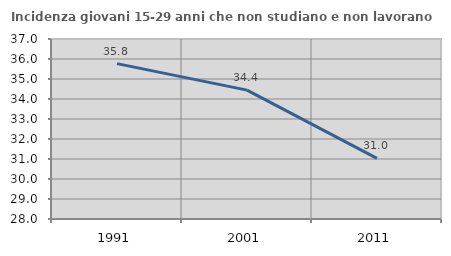
| Category | Incidenza giovani 15-29 anni che non studiano e non lavorano  |
|---|---|
| 1991.0 | 35.768 |
| 2001.0 | 34.444 |
| 2011.0 | 31.034 |